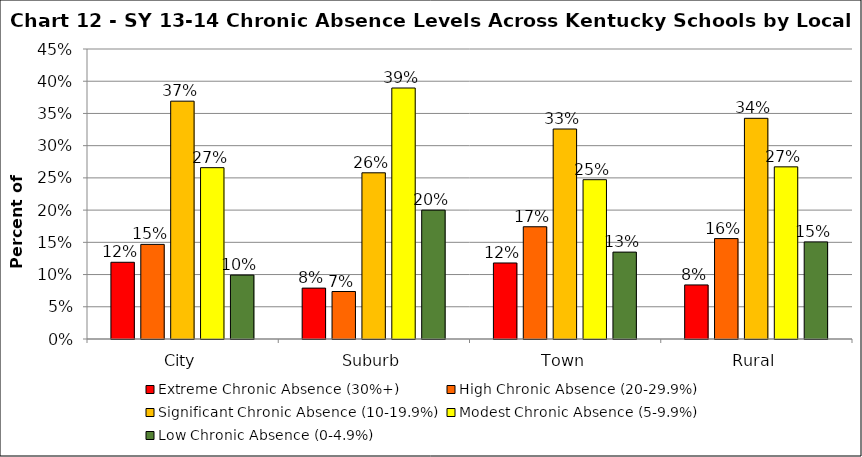
| Category | Extreme Chronic Absence (30%+) | High Chronic Absence (20-29.9%) | Significant Chronic Absence (10-19.9%) | Modest Chronic Absence (5-9.9%) | Low Chronic Absence (0-4.9%) |
|---|---|---|---|---|---|
| 0 | 0.119 | 0.147 | 0.369 | 0.266 | 0.099 |
| 1 | 0.079 | 0.074 | 0.258 | 0.389 | 0.2 |
| 2 | 0.118 | 0.174 | 0.326 | 0.247 | 0.135 |
| 3 | 0.084 | 0.156 | 0.342 | 0.267 | 0.151 |